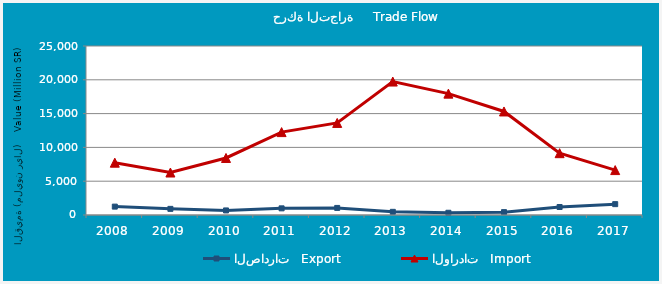
| Category | الصادرات   Export | الواردات   Import |
|---|---|---|
| 2008.0 | 1239482411 | 7740481734 |
| 2009.0 | 908083902 | 6283353783 |
| 2010.0 | 675342787 | 8437497461 |
| 2011.0 | 982486532 | 12263537558 |
| 2012.0 | 1046805541 | 13620325970 |
| 2013.0 | 467488414 | 19739585467 |
| 2014.0 | 332025650 | 17952876578 |
| 2015.0 | 423830081 | 15316076450 |
| 2016.0 | 1181915519 | 9144531694 |
| 2017.0 | 1605620620 | 6643713068 |